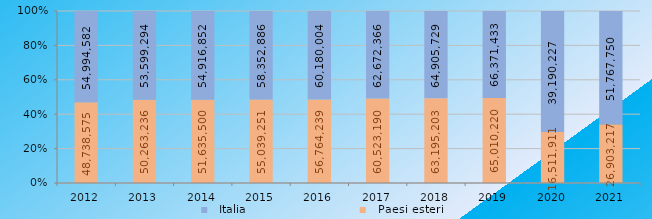
| Category |   Paesi esteri |   Italia |
|---|---|---|
| 2012 | 48738575 | 54994582 |
| 2013 | 50263236 | 53599294 |
| 2014 | 51635500 | 54916852 |
| 2015 | 55039251 | 58352886 |
| 2016 | 56764239 | 60180004 |
| 2017 | 60523190 | 62672366 |
| 2018 | 63195203 | 64905729 |
| 2019 | 65010220 | 66371433 |
| 2020 | 16511911 | 39190227 |
| 2021 | 26903217 | 51767750 |